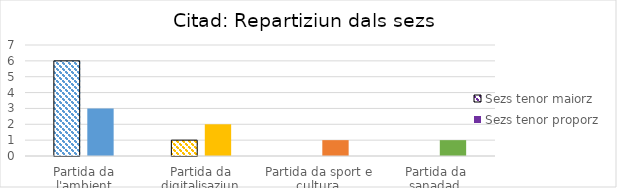
| Category | Sezs tenor maiorz | Sezs tenor proporz |
|---|---|---|
| Partida da l'ambient | 6 | 3 |
| Partida da digitalisaziun | 1 | 2 |
| Partida da sport e cultura  | 0 | 1 |
| Partida da sanadad  | 0 | 1 |